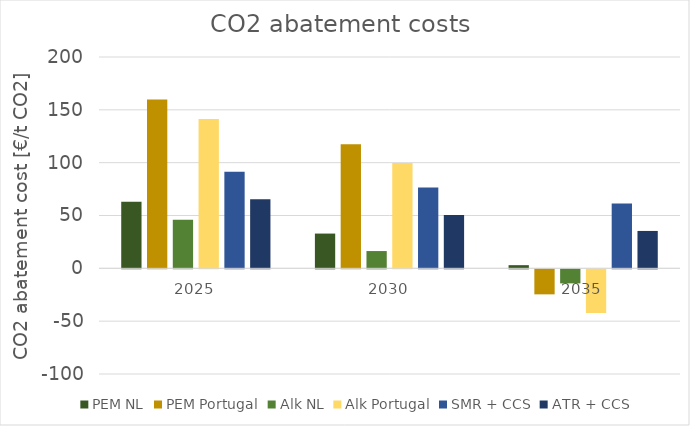
| Category | PEM NL | PEM Portugal | Alk NL | Alk Portugal | SMR + CCS | ATR + CCS  |
|---|---|---|---|---|---|---|
| 2025.0 | 63.101 | 159.838 | 46.026 | 141.442 | 91.466 | 65.384 |
| 2030.0 | 32.901 | 117.45 | 16.359 | 99.629 | 76.466 | 50.384 |
| 2035.0 | 3 | -23.673 | -13.287 | -41.22 | 61.466 | 35.384 |